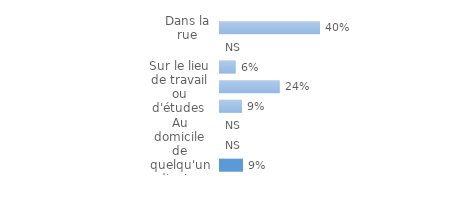
| Category | Series 0 |
|---|---|
| Dans la rue | 0.397 |
| Dans un transport en commun | 0 |
| Dans un établissement commercial | 0.062 |
| Sur le lieu de travail ou d'études  | 0.237 |
| Au domicile de la victime | 0.087 |
| Dans l'immeuble de la victime | 0 |
| Au domicile de quelqu'un d'autre | 0 |
| Dans un autre lieu | 0.091 |